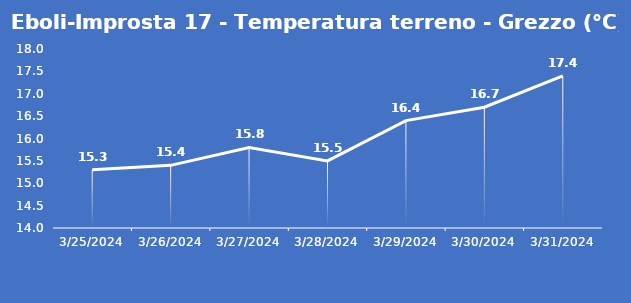
| Category | Eboli-Improsta 17 - Temperatura terreno - Grezzo (°C) |
|---|---|
| 3/25/24 | 15.3 |
| 3/26/24 | 15.4 |
| 3/27/24 | 15.8 |
| 3/28/24 | 15.5 |
| 3/29/24 | 16.4 |
| 3/30/24 | 16.7 |
| 3/31/24 | 17.4 |